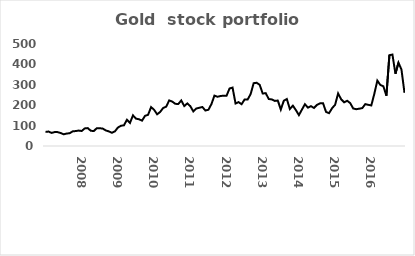
| Category | Series 0 |
|---|---|
| nan | 68.984 |
| nan | 70.865 |
| nan | 64.167 |
| nan | 68.09 |
| nan | 68.034 |
| nan | 63.837 |
| nan | 57.413 |
| nan | 60.96 |
| nan | 62.612 |
| nan | 71.78 |
| nan | 73.247 |
| nan | 75.632 |
| 2008.0 | 73.595 |
| nan | 86.235 |
| nan | 87.688 |
| nan | 74.75 |
| nan | 73.198 |
| nan | 87.47 |
| nan | 87.239 |
| nan | 85.175 |
| nan | 76.221 |
| nan | 71.551 |
| nan | 64.813 |
| nan | 71.627 |
| 2009.0 | 90.492 |
| nan | 99.028 |
| nan | 101.48 |
| nan | 128.84 |
| nan | 113.018 |
| nan | 150.095 |
| nan | 134.005 |
| nan | 131.08 |
| nan | 124.312 |
| nan | 147.955 |
| nan | 152.93 |
| nan | 190.671 |
| 2010.0 | 177.467 |
| nan | 155.464 |
| nan | 166.77 |
| nan | 186.314 |
| nan | 192.936 |
| nan | 223.367 |
| nan | 217.868 |
| nan | 206.949 |
| nan | 205.519 |
| nan | 223.277 |
| nan | 195.794 |
| nan | 208.732 |
| 2011.0 | 195.208 |
| nan | 169.527 |
| nan | 183.791 |
| nan | 187.335 |
| nan | 191.117 |
| nan | 173.998 |
| nan | 177.645 |
| nan | 205.262 |
| nan | 247.017 |
| nan | 241.415 |
| nan | 244.856 |
| nan | 246.771 |
| 2012.0 | 245.917 |
| nan | 281.67 |
| nan | 286.512 |
| nan | 208.141 |
| nan | 215.088 |
| nan | 204.869 |
| nan | 228.259 |
| nan | 227.745 |
| nan | 254.572 |
| nan | 307.961 |
| nan | 309.906 |
| nan | 299.8 |
| 2013.0 | 257.151 |
| nan | 259.105 |
| nan | 230.258 |
| nan | 228.279 |
| nan | 220.958 |
| nan | 222.883 |
| nan | 178.728 |
| nan | 222.016 |
| nan | 230.302 |
| nan | 181.31 |
| nan | 197.72 |
| nan | 176.04 |
| 2014.0 | 151.404 |
| nan | 178.485 |
| nan | 204.851 |
| nan | 187.772 |
| nan | 195.142 |
| nan | 186.514 |
| nan | 201.833 |
| nan | 209.148 |
| nan | 209.501 |
| nan | 166.847 |
| nan | 160.901 |
| nan | 185.379 |
| 2015.0 | 202.069 |
| nan | 257.661 |
| nan | 228.873 |
| nan | 214.274 |
| nan | 221.714 |
| nan | 210.417 |
| nan | 183.876 |
| nan | 180.445 |
| nan | 182.881 |
| nan | 185.667 |
| nan | 205.269 |
| nan | 201.807 |
| 2016.0 | 198.795 |
| nan | 255.908 |
| nan | 320.437 |
| nan | 299.052 |
| nan | 292.825 |
| nan | 246.531 |
| nan | 445.109 |
| nan | 448.298 |
| nan | 354.164 |
| nan | 408.668 |
| nan | 374.382 |
| nan | 260.559 |